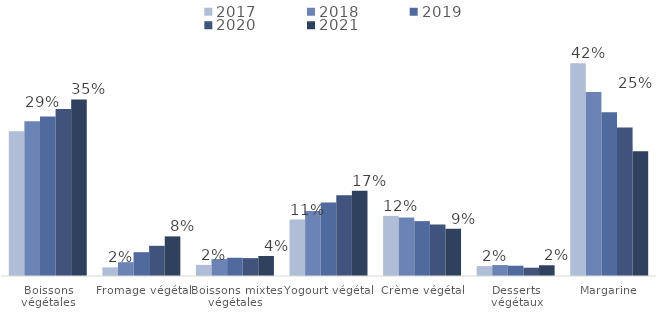
| Category | 2017 | 2018 | 2019 | 2020 | 2021 |
|---|---|---|---|---|---|
| Boissons végétales | 0.287 | 0.307 | 0.316 | 0.331 | 0.35 |
| Fromage végétal | 0.017 | 0.027 | 0.047 | 0.06 | 0.079 |
| Boissons mixtes végétales | 0.022 | 0.034 | 0.036 | 0.035 | 0.04 |
| Yogourt végétal | 0.112 | 0.129 | 0.146 | 0.16 | 0.169 |
| Crème végétal | 0.119 | 0.116 | 0.109 | 0.102 | 0.094 |
| Desserts végétaux | 0.02 | 0.022 | 0.02 | 0.016 | 0.021 |
| Margarine | 0.422 | 0.365 | 0.324 | 0.294 | 0.247 |